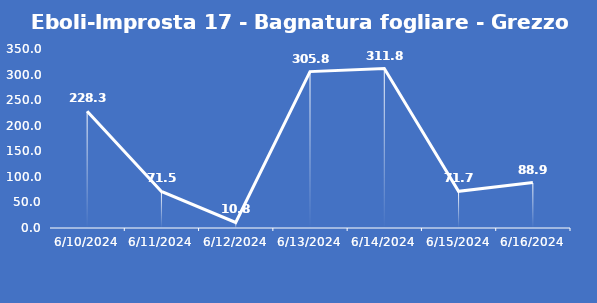
| Category | Eboli-Improsta 17 - Bagnatura fogliare - Grezzo (min) |
|---|---|
| 6/10/24 | 228.3 |
| 6/11/24 | 71.5 |
| 6/12/24 | 10.8 |
| 6/13/24 | 305.8 |
| 6/14/24 | 311.8 |
| 6/15/24 | 71.7 |
| 6/16/24 | 88.9 |